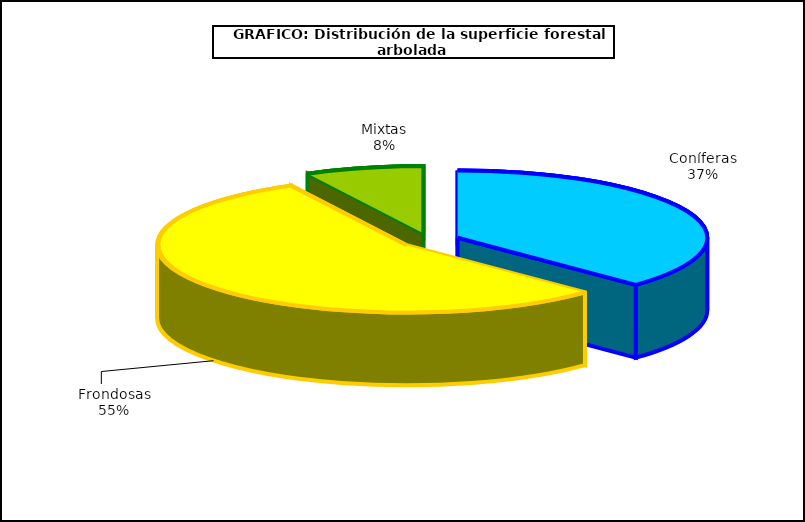
| Category | Series 0 |
|---|---|
| Coníferas | 6829841.65 |
| Frondosas | 10057953.4 |
| Mixtas | 1401822.77 |